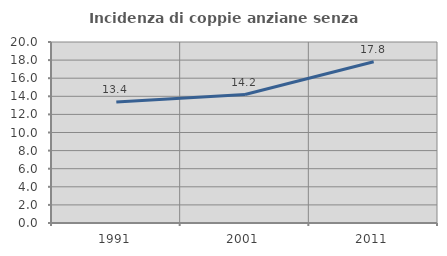
| Category | Incidenza di coppie anziane senza figli  |
|---|---|
| 1991.0 | 13.377 |
| 2001.0 | 14.194 |
| 2011.0 | 17.812 |